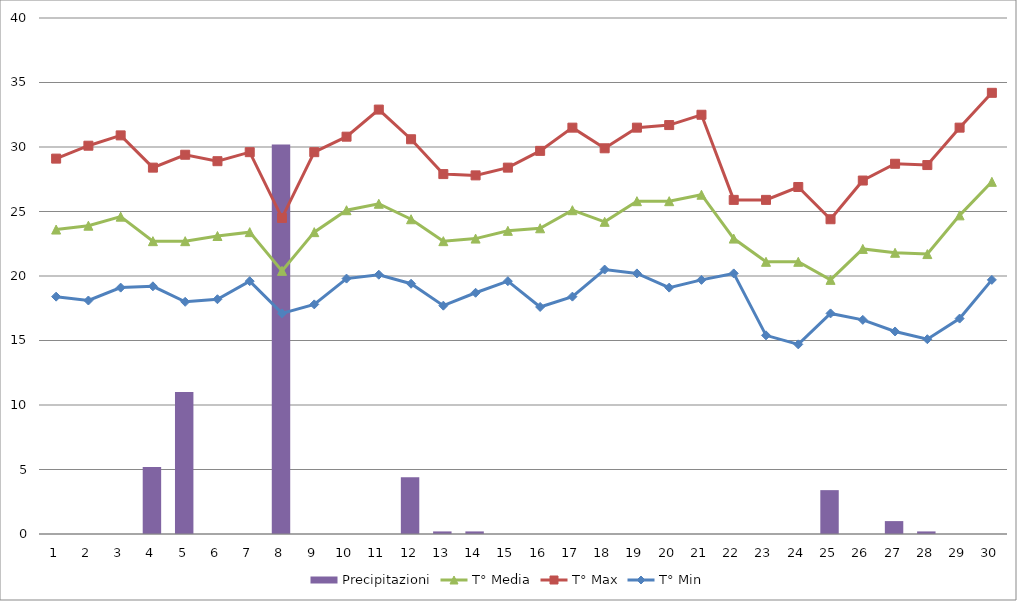
| Category | Precipitazioni |
|---|---|
| 0 | 0 |
| 1 | 0 |
| 2 | 0 |
| 3 | 5.2 |
| 4 | 11 |
| 5 | 0 |
| 6 | 0 |
| 7 | 30.2 |
| 8 | 0 |
| 9 | 0 |
| 10 | 0 |
| 11 | 4.4 |
| 12 | 0.2 |
| 13 | 0.2 |
| 14 | 0 |
| 15 | 0 |
| 16 | 0 |
| 17 | 0 |
| 18 | 0 |
| 19 | 0 |
| 20 | 0 |
| 21 | 0 |
| 22 | 0 |
| 23 | 0 |
| 24 | 3.4 |
| 25 | 0 |
| 26 | 1 |
| 27 | 0.2 |
| 28 | 0 |
| 29 | 0 |